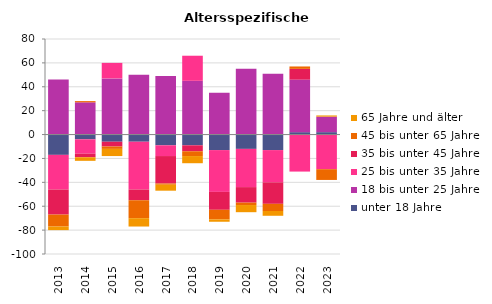
| Category | unter 18 Jahre | 18 bis unter 25 Jahre | 25 bis unter 35 Jahre | 35 bis unter 45 Jahre | 45 bis unter 65 Jahre | 65 Jahre und älter |
|---|---|---|---|---|---|---|
| 2013.0 | -17 | 46 | -29 | -21 | -10 | -3 |
| 2014.0 | -4 | 27 | -12 | -3 | 1 | -3 |
| 2015.0 | -6 | 47 | 13 | -4 | -2 | -6 |
| 2016.0 | -6 | 50 | -40 | -9 | -15 | -7 |
| 2017.0 | -9 | 49 | -9 | -23 | -1 | -5 |
| 2018.0 | -9 | 45 | 21 | -5 | -4 | -6 |
| 2019.0 | -13 | 35 | -35 | -15 | -8 | -2 |
| 2020.0 | -12 | 55 | -32 | -13 | -2 | -6 |
| 2021.0 | -13 | 51 | -27 | -18 | -6 | -4 |
| 2022.0 | 2 | 44 | -31 | 9 | 2 | 0 |
| 2023.0 | 2 | 13 | -29 | 0 | -9 | 1 |